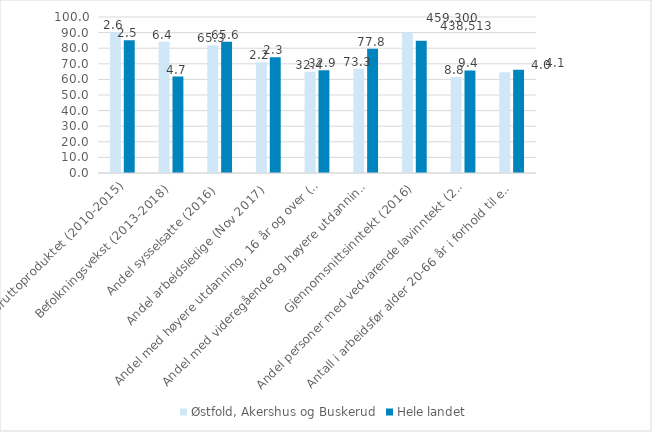
| Category | Østfold, Akershus og Buskerud | Hele landet |
|---|---|---|
| Endring i bruttoproduktet (2010-2015) | 90.207 | 85.077 |
| Befolkningsvekst (2013-2018) | 84.211 | 61.842 |
| Andel sysselsatte (2016) | 81.746 | 84.127 |
| Andel arbeidsledige (Nov 2017) | 70.968 | 74.194 |
| Andel med høyere utdanning, 16 år og over (2016) | 64.93 | 65.932 |
| Andel med videregående og høyere utdanning, 25-29 år (2016) | 66.762 | 79.656 |
| Gjennomsnittsinntekt (2016) | 90.005 | 84.798 |
| Andel personer med vedvarende lavinntekt (2014-16) | 61.538 | 65.734 |
| Antall i arbeidsfør alder 20-66 år i forhold til eldre 67 år og over (2018) | 64.516 | 66.129 |